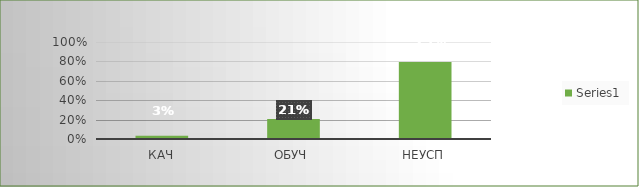
| Category | Series 0 |
|---|---|
| кач | 0.034 |
| обуч | 0.207 |
| неусп | 0.793 |